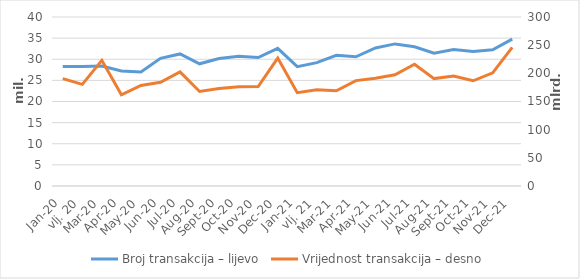
| Category | Broj transakcija – lijevo |
|---|---|
| sij.20 | 28256095 |
| vlj. 20 | 28274985 |
| ožu.20 | 28400981 |
| tra.20 | 27204598 |
| svi.20 | 26966811 |
| lip.20 | 30208024 |
| srp.20 | 31260868 |
| kol.20 | 28920407 |
| ruj.20 | 30154281 |
| lis.20 | 30730172 |
| stu.20 | 30406511 |
| pro.20 | 32570998 |
| sij.21 | 28234650 |
| vlj. 21 | 29203774 |
| ožu.21 | 30934006 |
| tra.21 | 30576547 |
| svi.21 | 32664164 |
| lip.21 | 33632088 |
| srp.21 | 32954974 |
| kol.21 | 31437818 |
| ruj.21 | 32298015 |
| lis.21 | 31846909 |
| stu.21 | 32256891 |
| pro.21 | 34755901 |